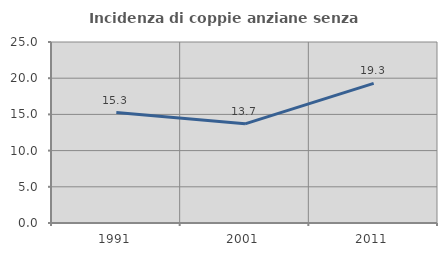
| Category | Incidenza di coppie anziane senza figli  |
|---|---|
| 1991.0 | 15.261 |
| 2001.0 | 13.693 |
| 2011.0 | 19.283 |